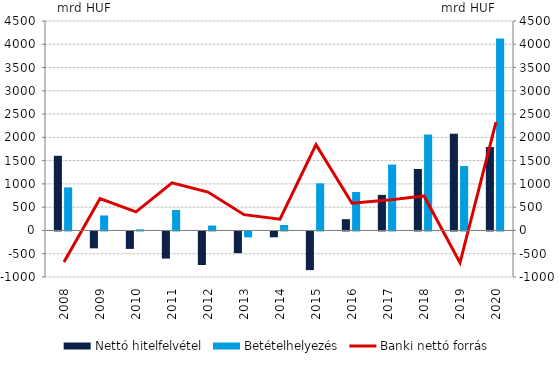
| Category | Nettó hitelfelvétel | Betételhelyezés |
|---|---|---|
| 2008.0 | 1604.117 | 924.526 |
| 2009.0 | -363.024 | 322.449 |
| 2010.0 | -375.15 | 23.517 |
| 2011.0 | -582.414 | 439.017 |
| 2012.0 | -720.502 | 104.961 |
| 2013.0 | -466.305 | -126.817 |
| 2014.0 | -125.073 | 117.279 |
| 2015.0 | -830.803 | 1012.037 |
| 2016.0 | 241.811 | 825.492 |
| 2017.0 | 763.636 | 1415.416 |
| 2018.0 | 1320.254 | 2062.225 |
| 2019.0 | 2077.859 | 1384.024 |
| 2020.0 | 1791.689 | 4121.545 |